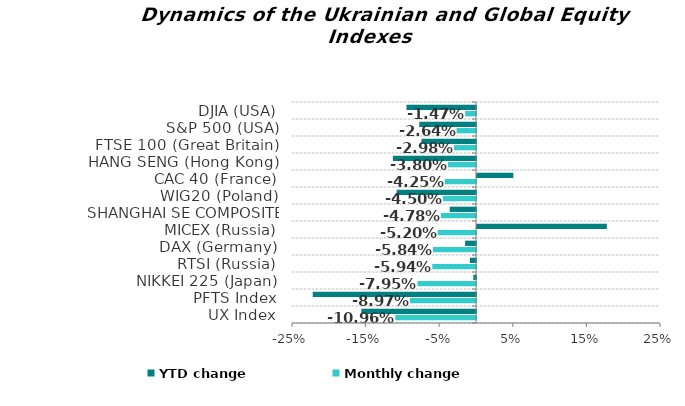
| Category | Monthly change | YTD change |
|---|---|---|
| UX Index | -0.11 | -0.156 |
| PFTS Index | -0.09 | -0.222 |
| NIKKEI 225 (Japan) | -0.08 | -0.004 |
| RTSI (Russia) | -0.059 | -0.008 |
| DAX (Germany) | -0.058 | -0.015 |
| MICEX (Russia) | -0.052 | 0.176 |
| SHANGHAI SE COMPOSITE (China) | -0.048 | -0.036 |
| WIG20 (Poland) | -0.045 | -0.108 |
| CAC 40 (France) | -0.042 | 0.049 |
| HANG SENG (Hong Kong) | -0.038 | -0.113 |
| FTSE 100 (Great Britain) | -0.03 | -0.074 |
| S&P 500 (USA) | -0.026 | -0.077 |
| DJIA (USA) | -0.015 | -0.094 |